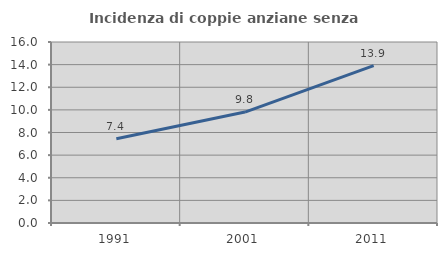
| Category | Incidenza di coppie anziane senza figli  |
|---|---|
| 1991.0 | 7.448 |
| 2001.0 | 9.807 |
| 2011.0 | 13.913 |